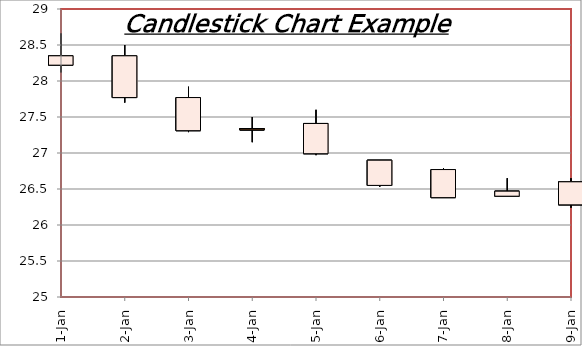
| Category | Open | High | Low | Close |
|---|---|---|---|---|
| 2020-01-01 | 28.22 | 28.66 | 28.12 | 28.35 |
| 2020-01-02 | 27.77 | 28.5 | 27.7 | 28.35 |
| 2020-01-03 | 27.31 | 27.92 | 27.29 | 27.77 |
| 2020-01-04 | 27.34 | 27.5 | 27.15 | 27.32 |
| 2020-01-05 | 26.99 | 27.6 | 26.97 | 27.41 |
| 2020-01-06 | 26.55 | 26.9 | 26.53 | 26.9 |
| 2020-01-07 | 26.38 | 26.79 | 26.38 | 26.77 |
| 2020-01-08 | 26.4 | 26.65 | 26.4 | 26.47 |
| 2020-01-09 | 26.28 | 26.65 | 26.24 | 26.6 |